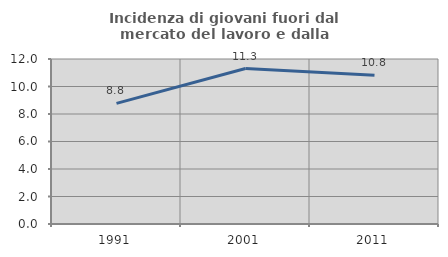
| Category | Incidenza di giovani fuori dal mercato del lavoro e dalla formazione  |
|---|---|
| 1991.0 | 8.772 |
| 2001.0 | 11.304 |
| 2011.0 | 10.811 |